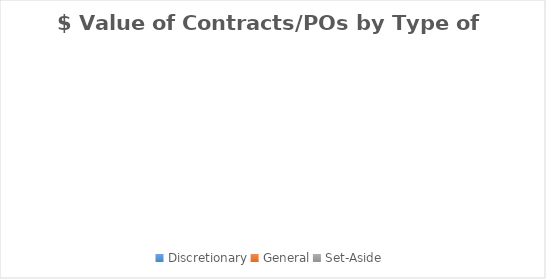
| Category | $ Value |
|---|---|
| Discretionary | 0 |
| General | 0 |
| Set-Aside | 0 |